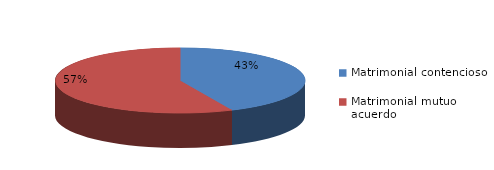
| Category | Series 0 |
|---|---|
| 0 | 92 |
| 1 | 121 |